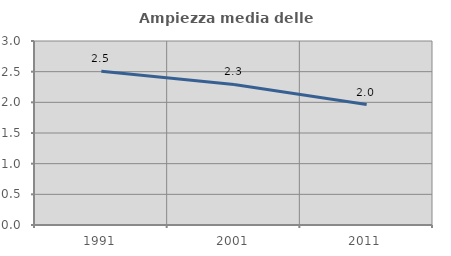
| Category | Ampiezza media delle famiglie |
|---|---|
| 1991.0 | 2.506 |
| 2001.0 | 2.292 |
| 2011.0 | 1.964 |